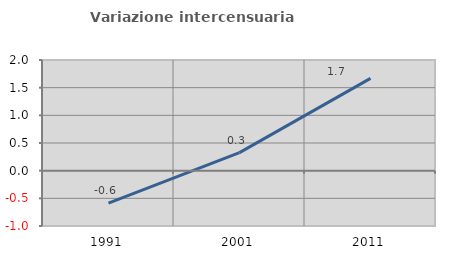
| Category | Variazione intercensuaria annua |
|---|---|
| 1991.0 | -0.586 |
| 2001.0 | 0.327 |
| 2011.0 | 1.668 |